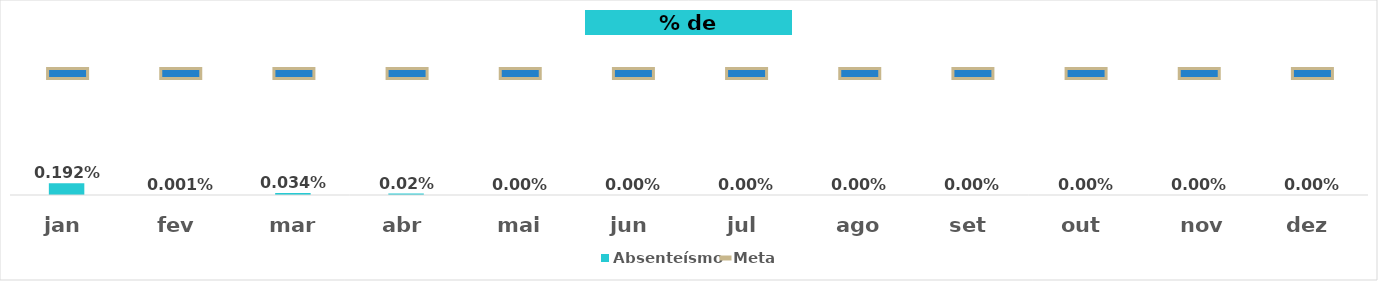
| Category | Absenteísmo |
|---|---|
| jan | 0.002 |
| fev | 0 |
| mar | 0 |
| abr | 0 |
| mai | 0 |
| jun | 0 |
| jul | 0 |
| ago | 0 |
| set | 0 |
| out | 0 |
| nov | 0 |
| dez | 0 |